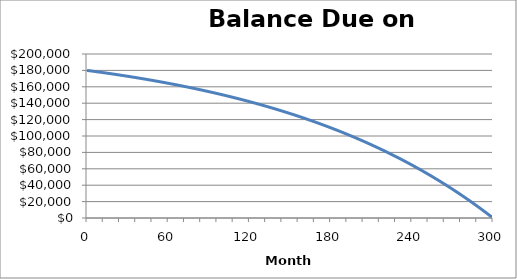
| Category | Series 0 |
|---|---|
| 0.0 | 180000 |
| 1.0 | 179781.29 |
| 2.0 | 179561.29 |
| 3.0 | 179339.98 |
| 4.0 | 179117.36 |
| 5.0 | 178893.43 |
| 6.0 | 178668.17 |
| 7.0 | 178441.58 |
| 8.0 | 178213.65 |
| 9.0 | 177984.37 |
| 10.0 | 177753.73 |
| 11.0 | 177521.73 |
| 12.0 | 177288.36 |
| 13.0 | 177053.61 |
| 14.0 | 176817.47 |
| 15.0 | 176579.93 |
| 16.0 | 176340.98 |
| 17.0 | 176100.62 |
| 18.0 | 175858.84 |
| 19.0 | 175615.63 |
| 20.0 | 175370.98 |
| 21.0 | 175124.88 |
| 22.0 | 174877.33 |
| 23.0 | 174628.31 |
| 24.0 | 174377.82 |
| 25.0 | 174125.85 |
| 26.0 | 173872.38 |
| 27.0 | 173617.41 |
| 28.0 | 173360.94 |
| 29.0 | 173102.95 |
| 30.0 | 172843.43 |
| 31.0 | 172582.38 |
| 32.0 | 172319.78 |
| 33.0 | 172055.63 |
| 34.0 | 171789.92 |
| 35.0 | 171522.63 |
| 36.0 | 171253.76 |
| 37.0 | 170983.3 |
| 38.0 | 170711.24 |
| 39.0 | 170437.57 |
| 40.0 | 170162.28 |
| 41.0 | 169885.36 |
| 42.0 | 169606.81 |
| 43.0 | 169326.61 |
| 44.0 | 169044.75 |
| 45.0 | 168761.22 |
| 46.0 | 168476.01 |
| 47.0 | 168189.12 |
| 48.0 | 167900.53 |
| 49.0 | 167610.23 |
| 50.0 | 167318.21 |
| 51.0 | 167024.47 |
| 52.0 | 166728.99 |
| 53.0 | 166431.76 |
| 54.0 | 166132.77 |
| 55.0 | 165832.01 |
| 56.0 | 165529.47 |
| 57.0 | 165225.14 |
| 58.0 | 164919.01 |
| 59.0 | 164611.07 |
| 60.0 | 164301.31 |
| 61.0 | 163989.72 |
| 62.0 | 163676.28 |
| 63.0 | 163360.99 |
| 64.0 | 163043.83 |
| 65.0 | 162724.8 |
| 66.0 | 162403.88 |
| 67.0 | 162081.06 |
| 68.0 | 161756.33 |
| 69.0 | 161429.68 |
| 70.0 | 161101.1 |
| 71.0 | 160770.57 |
| 72.0 | 160438.09 |
| 73.0 | 160103.64 |
| 74.0 | 159767.21 |
| 75.0 | 159428.79 |
| 76.0 | 159088.37 |
| 77.0 | 158745.93 |
| 78.0 | 158401.47 |
| 79.0 | 158054.97 |
| 80.0 | 157706.42 |
| 81.0 | 157355.81 |
| 82.0 | 157003.12 |
| 83.0 | 156648.35 |
| 84.0 | 156291.48 |
| 85.0 | 155932.49 |
| 86.0 | 155571.38 |
| 87.0 | 155208.13 |
| 88.0 | 154842.73 |
| 89.0 | 154475.17 |
| 90.0 | 154105.44 |
| 91.0 | 153733.52 |
| 92.0 | 153359.4 |
| 93.0 | 152983.07 |
| 94.0 | 152604.51 |
| 95.0 | 152223.71 |
| 96.0 | 151840.66 |
| 97.0 | 151455.34 |
| 98.0 | 151067.74 |
| 99.0 | 150677.85 |
| 100.0 | 150285.65 |
| 101.0 | 149891.13 |
| 102.0 | 149494.28 |
| 103.0 | 149095.08 |
| 104.0 | 148693.52 |
| 105.0 | 148289.58 |
| 106.0 | 147883.25 |
| 107.0 | 147474.52 |
| 108.0 | 147063.37 |
| 109.0 | 146649.78 |
| 110.0 | 146233.75 |
| 111.0 | 145815.26 |
| 112.0 | 145394.29 |
| 113.0 | 144970.83 |
| 114.0 | 144544.86 |
| 115.0 | 144116.37 |
| 116.0 | 143685.35 |
| 117.0 | 143251.78 |
| 118.0 | 142815.64 |
| 119.0 | 142376.92 |
| 120.0 | 141935.61 |
| 121.0 | 141491.69 |
| 122.0 | 141045.14 |
| 123.0 | 140595.95 |
| 124.0 | 140144.1 |
| 125.0 | 139689.58 |
| 126.0 | 139232.37 |
| 127.0 | 138772.45 |
| 128.0 | 138309.81 |
| 129.0 | 137844.43 |
| 130.0 | 137376.3 |
| 131.0 | 136905.4 |
| 132.0 | 136431.71 |
| 133.0 | 135955.22 |
| 134.0 | 135475.91 |
| 135.0 | 134993.77 |
| 136.0 | 134508.77 |
| 137.0 | 134020.9 |
| 138.0 | 133530.15 |
| 139.0 | 133036.49 |
| 140.0 | 132539.91 |
| 141.0 | 132040.39 |
| 142.0 | 131537.92 |
| 143.0 | 131032.48 |
| 144.0 | 130524.05 |
| 145.0 | 130012.61 |
| 146.0 | 129498.14 |
| 147.0 | 128980.63 |
| 148.0 | 128460.06 |
| 149.0 | 127936.41 |
| 150.0 | 127409.66 |
| 151.0 | 126879.79 |
| 152.0 | 126346.79 |
| 153.0 | 125810.63 |
| 154.0 | 125271.3 |
| 155.0 | 124728.78 |
| 156.0 | 124183.05 |
| 157.0 | 123634.09 |
| 158.0 | 123081.88 |
| 159.0 | 122526.4 |
| 160.0 | 121967.64 |
| 161.0 | 121405.57 |
| 162.0 | 120840.18 |
| 163.0 | 120271.44 |
| 164.0 | 119699.34 |
| 165.0 | 119123.85 |
| 166.0 | 118544.96 |
| 167.0 | 117962.64 |
| 168.0 | 117376.88 |
| 169.0 | 116787.65 |
| 170.0 | 116194.93 |
| 171.0 | 115598.71 |
| 172.0 | 114998.96 |
| 173.0 | 114395.66 |
| 174.0 | 113788.79 |
| 175.0 | 113178.33 |
| 176.0 | 112564.26 |
| 177.0 | 111946.56 |
| 178.0 | 111325.2 |
| 179.0 | 110700.16 |
| 180.0 | 110071.43 |
| 181.0 | 109438.98 |
| 182.0 | 108802.78 |
| 183.0 | 108162.82 |
| 184.0 | 107519.07 |
| 185.0 | 106871.51 |
| 186.0 | 106220.12 |
| 187.0 | 105564.88 |
| 188.0 | 104905.76 |
| 189.0 | 104242.74 |
| 190.0 | 103575.8 |
| 191.0 | 102904.91 |
| 192.0 | 102230.05 |
| 193.0 | 101551.2 |
| 194.0 | 100868.33 |
| 195.0 | 100181.42 |
| 196.0 | 99490.45 |
| 197.0 | 98795.39 |
| 198.0 | 98096.22 |
| 199.0 | 97392.91 |
| 200.0 | 96685.44 |
| 201.0 | 95973.79 |
| 202.0 | 95257.92 |
| 203.0 | 94537.82 |
| 204.0 | 93813.46 |
| 205.0 | 93084.81 |
| 206.0 | 92351.85 |
| 207.0 | 91614.56 |
| 208.0 | 90872.9 |
| 209.0 | 90126.85 |
| 210.0 | 89376.39 |
| 211.0 | 88621.49 |
| 212.0 | 87862.12 |
| 213.0 | 87098.26 |
| 214.0 | 86329.88 |
| 215.0 | 85556.96 |
| 216.0 | 84779.46 |
| 217.0 | 83997.36 |
| 218.0 | 83210.63 |
| 219.0 | 82419.25 |
| 220.0 | 81623.19 |
| 221.0 | 80822.42 |
| 222.0 | 80016.91 |
| 223.0 | 79206.63 |
| 224.0 | 78391.56 |
| 225.0 | 77571.67 |
| 226.0 | 76746.93 |
| 227.0 | 75917.31 |
| 228.0 | 75082.78 |
| 229.0 | 74243.31 |
| 230.0 | 73398.87 |
| 231.0 | 72549.44 |
| 232.0 | 71694.98 |
| 233.0 | 70835.47 |
| 234.0 | 69970.87 |
| 235.0 | 69101.15 |
| 236.0 | 68226.29 |
| 237.0 | 67346.25 |
| 238.0 | 66461.01 |
| 239.0 | 65570.53 |
| 240.0 | 64674.78 |
| 241.0 | 63773.73 |
| 242.0 | 62867.35 |
| 243.0 | 61955.61 |
| 244.0 | 61038.47 |
| 245.0 | 60115.9 |
| 246.0 | 59187.88 |
| 247.0 | 58254.36 |
| 248.0 | 57315.32 |
| 249.0 | 56370.73 |
| 250.0 | 55420.55 |
| 251.0 | 54464.74 |
| 252.0 | 53503.28 |
| 253.0 | 52536.13 |
| 254.0 | 51563.26 |
| 255.0 | 50584.63 |
| 256.0 | 49600.21 |
| 257.0 | 48609.97 |
| 258.0 | 47613.87 |
| 259.0 | 46611.88 |
| 260.0 | 45603.96 |
| 261.0 | 44590.07 |
| 262.0 | 43570.18 |
| 263.0 | 42544.26 |
| 264.0 | 41512.27 |
| 265.0 | 40474.17 |
| 266.0 | 39429.93 |
| 267.0 | 38379.51 |
| 268.0 | 37322.88 |
| 269.0 | 36260 |
| 270.0 | 35190.83 |
| 271.0 | 34115.33 |
| 272.0 | 33033.47 |
| 273.0 | 31945.21 |
| 274.0 | 30850.51 |
| 275.0 | 29749.33 |
| 276.0 | 28641.64 |
| 277.0 | 27527.39 |
| 278.0 | 26406.55 |
| 279.0 | 25279.08 |
| 280.0 | 24144.94 |
| 281.0 | 23004.09 |
| 282.0 | 21856.49 |
| 283.0 | 20702.1 |
| 284.0 | 19540.88 |
| 285.0 | 18372.79 |
| 286.0 | 17197.79 |
| 287.0 | 16015.83 |
| 288.0 | 14826.88 |
| 289.0 | 13630.9 |
| 290.0 | 12427.84 |
| 291.0 | 11217.66 |
| 292.0 | 10000.32 |
| 293.0 | 8775.78 |
| 294.0 | 7543.99 |
| 295.0 | 6304.92 |
| 296.0 | 5058.51 |
| 297.0 | 3804.73 |
| 298.0 | 2543.53 |
| 299.0 | 1274.87 |
| 300.0 | 0 |